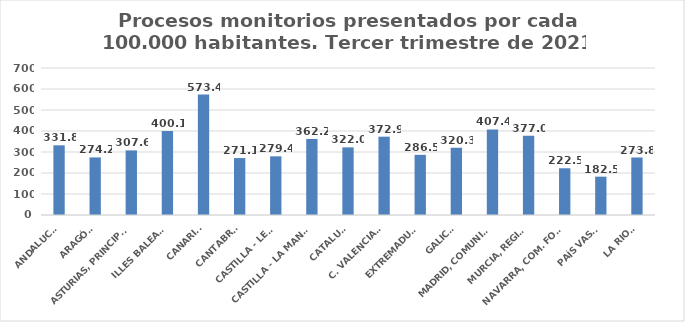
| Category | Series 0 |
|---|---|
| ANDALUCÍA | 331.849 |
| ARAGÓN | 274.187 |
| ASTURIAS, PRINCIPADO | 307.644 |
| ILLES BALEARS | 400.057 |
| CANARIAS | 573.418 |
| CANTABRIA | 271.09 |
| CASTILLA - LEÓN | 279.387 |
| CASTILLA - LA MANCHA | 362.195 |
| CATALUÑA | 322.048 |
| C. VALENCIANA | 372.934 |
| EXTREMADURA | 286.466 |
| GALICIA | 320.275 |
| MADRID, COMUNIDAD | 407.422 |
| MURCIA, REGIÓN | 376.959 |
| NAVARRA, COM. FORAL | 222.534 |
| PAÍS VASCO | 182.549 |
| LA RIOJA | 273.789 |